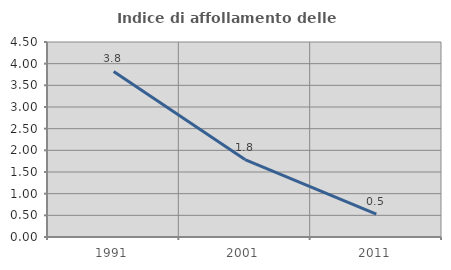
| Category | Indice di affollamento delle abitazioni  |
|---|---|
| 1991.0 | 3.822 |
| 2001.0 | 1.786 |
| 2011.0 | 0.529 |